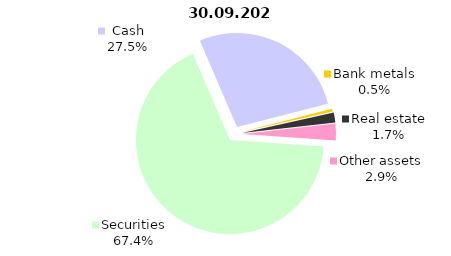
| Category | Total |
|---|---|
| Securities | 1430.447 |
| Cash | 582.86 |
| Bank metals | 10.307 |
| Real estate | 36.037 |
| Other assets | 61.754 |